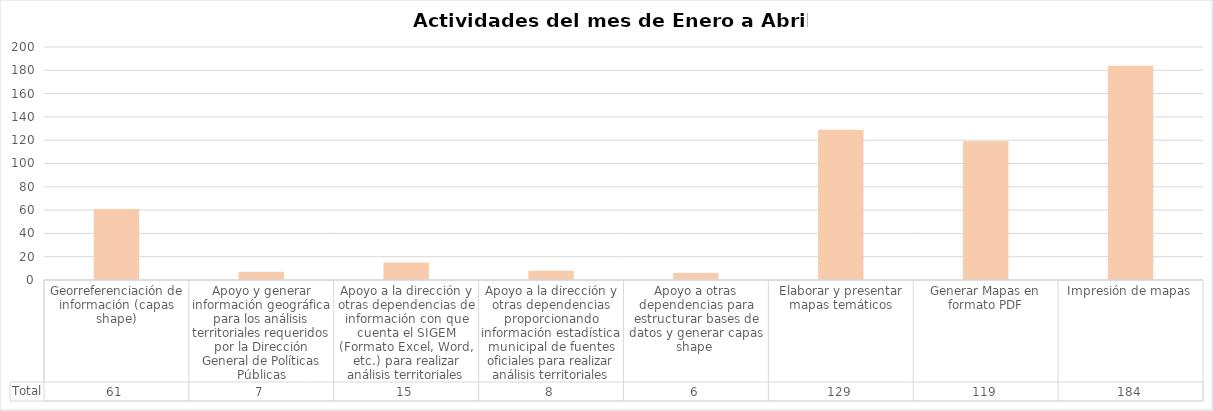
| Category | Total |
|---|---|
| Georreferenciación de información (capas shape) | 61 |
| Apoyo y generar información geográfica para los análisis territoriales requeridos por la Dirección General de Políticas Públicas | 7 |
| Apoyo a la dirección y otras dependencias de información con que cuenta el SIGEM (Formato Excel, Word, etc.) para realizar análisis territoriales | 15 |
| Apoyo a la dirección y otras dependencias proporcionando información estadística municipal de fuentes oficiales para realizar análisis territoriales | 8 |
| Apoyo a otras dependencias para estructurar bases de datos y generar capas shape  | 6 |
| Elaborar y presentar mapas temáticos | 129 |
| Generar Mapas en formato PDF | 119 |
| Impresión de mapas | 184 |